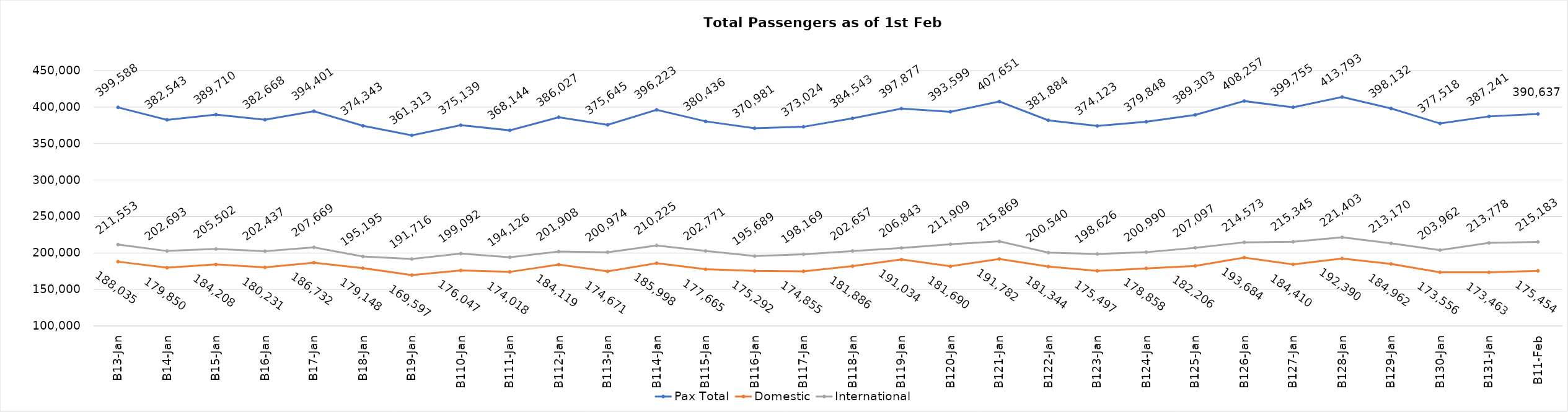
| Category | Pax Total | Domestic | International |
|---|---|---|---|
| 2024-01-03 | 399588 | 188035 | 211553 |
| 2024-01-04 | 382543 | 179850 | 202693 |
| 2024-01-05 | 389710 | 184208 | 205502 |
| 2024-01-06 | 382668 | 180231 | 202437 |
| 2024-01-07 | 394401 | 186732 | 207669 |
| 2024-01-08 | 374343 | 179148 | 195195 |
| 2024-01-09 | 361313 | 169597 | 191716 |
| 2024-01-10 | 375139 | 176047 | 199092 |
| 2024-01-11 | 368144 | 174018 | 194126 |
| 2024-01-12 | 386027 | 184119 | 201908 |
| 2024-01-13 | 375645 | 174671 | 200974 |
| 2024-01-14 | 396223 | 185998 | 210225 |
| 2024-01-15 | 380436 | 177665 | 202771 |
| 2024-01-16 | 370981 | 175292 | 195689 |
| 2024-01-17 | 373024 | 174855 | 198169 |
| 2024-01-18 | 384543 | 181886 | 202657 |
| 2024-01-19 | 397877 | 191034 | 206843 |
| 2024-01-20 | 393599 | 181690 | 211909 |
| 2024-01-21 | 407651 | 191782 | 215869 |
| 2024-01-22 | 381884 | 181344 | 200540 |
| 2024-01-23 | 374123 | 175497 | 198626 |
| 2024-01-24 | 379848 | 178858 | 200990 |
| 2024-01-25 | 389303 | 182206 | 207097 |
| 2024-01-26 | 408257 | 193684 | 214573 |
| 2024-01-27 | 399755 | 184410 | 215345 |
| 2024-01-28 | 413793 | 192390 | 221403 |
| 2024-01-29 | 398132 | 184962 | 213170 |
| 2024-01-30 | 377518 | 173556 | 203962 |
| 2024-01-31 | 387241 | 173463 | 213778 |
| 2024-02-01 | 390637 | 175454 | 215183 |